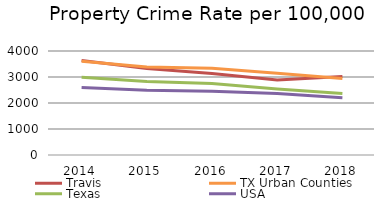
| Category | Travis  | TX Urban Counties | Texas | USA |
|---|---|---|---|---|
| 2014.0 | 3630.894 | 3607.784 | 2987.922 | 2596.094 |
| 2015.0 | 3329.093 | 3382.503 | 2822.778 | 2486.983 |
| 2016.0 | 3138.737 | 3337.497 | 2751.583 | 2448.636 |
| 2017.0 | 2884.651 | 3144.732 | 2539.672 | 2366.34 |
| 2018.0 | 3022.932 | 2943.43 | 2363.162 | 2199.499 |